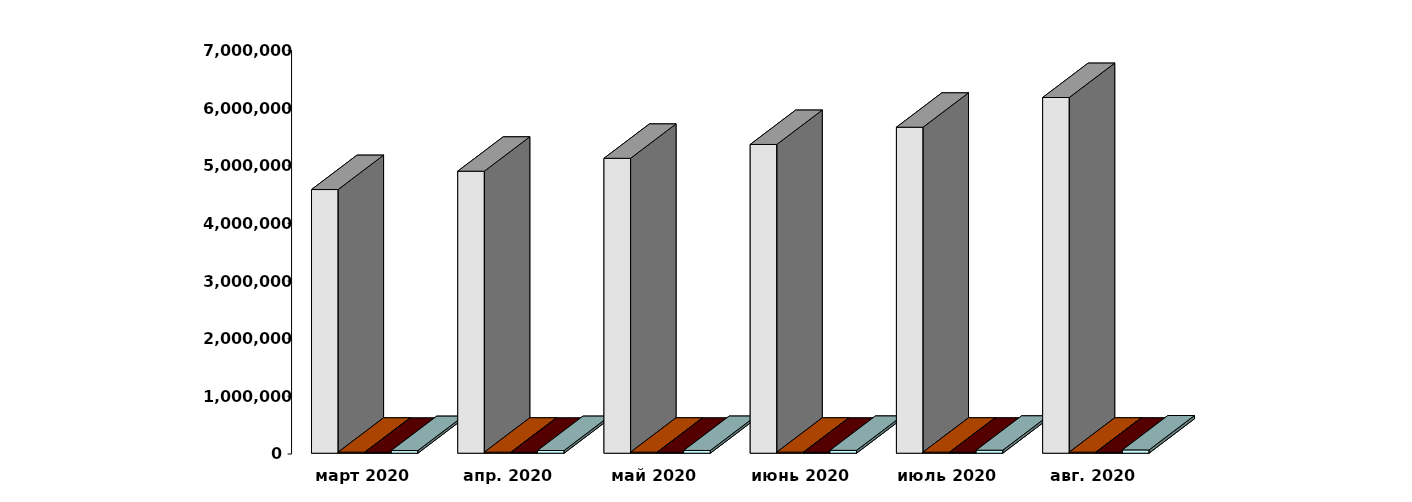
| Category | Физические лица | Юридические лица | Иностранные лица | Клиенты, передавшие свои средства в ДУ |
|---|---|---|---|---|
| 2020-03-30 | 4572906 | 17928 | 14988 | 46297 |
| 2020-04-30 | 4891213 | 18138 | 15242 | 46759 |
| 2020-05-30 | 5114736 | 18257 | 15483 | 47445 |
| 2020-06-30 | 5354906 | 18261 | 15817 | 49363 |
| 2020-07-31 | 5653690 | 18250 | 16100 | 51872 |
| 2020-08-31 | 6169141 | 18285 | 16204 | 57089 |